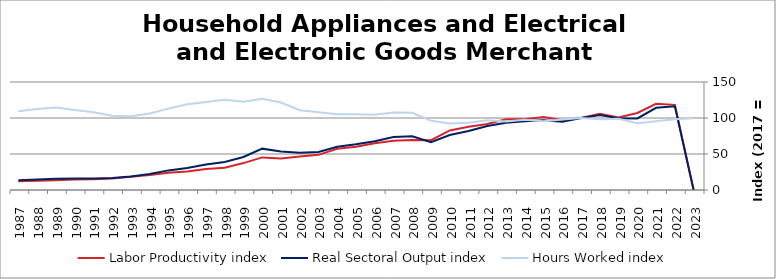
| Category | Labor Productivity index | Real Sectoral Output index | Hours Worked index |
|---|---|---|---|
| 2023.0 | 0 | 0 | 99.806 |
| 2022.0 | 118.235 | 116.32 | 98.38 |
| 2021.0 | 119.691 | 114.109 | 95.336 |
| 2020.0 | 106.992 | 99.352 | 92.859 |
| 2019.0 | 100.734 | 99.527 | 98.802 |
| 2018.0 | 105.824 | 104.111 | 98.381 |
| 2017.0 | 100 | 100 | 100 |
| 2016.0 | 96.983 | 94.812 | 97.761 |
| 2015.0 | 101.533 | 96.941 | 95.477 |
| 2014.0 | 98.119 | 95.648 | 97.482 |
| 2013.0 | 98.197 | 93.388 | 95.103 |
| 2012.0 | 91.64 | 88.877 | 96.985 |
| 2011.0 | 87.784 | 82.048 | 93.466 |
| 2010.0 | 82.66 | 76.324 | 92.335 |
| 2009.0 | 69.247 | 66.537 | 96.087 |
| 2008.0 | 69.506 | 74.546 | 107.252 |
| 2007.0 | 68.346 | 73.475 | 107.506 |
| 2006.0 | 64.88 | 67.766 | 104.448 |
| 2005.0 | 60.168 | 63.39 | 105.354 |
| 2004.0 | 57.174 | 60.066 | 105.057 |
| 2003.0 | 48.827 | 52.708 | 107.949 |
| 2002.0 | 46.598 | 51.621 | 110.78 |
| 2001.0 | 43.91 | 53.351 | 121.502 |
| 2000.0 | 45.263 | 57.43 | 126.878 |
| 1999.0 | 37.378 | 45.786 | 122.493 |
| 1998.0 | 31.012 | 38.905 | 125.45 |
| 1997.0 | 29.092 | 35.532 | 122.138 |
| 1996.0 | 25.766 | 30.648 | 118.949 |
| 1995.0 | 24.094 | 27.238 | 113.05 |
| 1994.0 | 20.901 | 22.199 | 106.213 |
| 1993.0 | 18.458 | 18.897 | 102.381 |
| 1992.0 | 16.125 | 16.616 | 103.048 |
| 1991.0 | 14.796 | 15.975 | 107.964 |
| 1990.0 | 14.478 | 16.093 | 111.154 |
| 1989.0 | 13.572 | 15.553 | 114.59 |
| 1988.0 | 12.883 | 14.495 | 112.512 |
| 1987.0 | 12.299 | 13.45 | 109.363 |